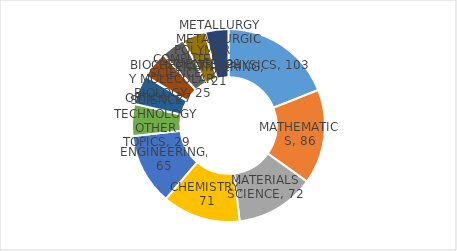
| Category | Series 0 |
|---|---|
| PHYSICS | 103 |
| MATHEMATICS | 86 |
| MATERIALS SCIENCE | 72 |
| CHEMISTRY | 71 |
| ENGINEERING | 65 |
| SCIENCE TECHNOLOGY OTHER TOPICS | 29 |
| OPTICS | 27 |
| BIOCHEMISTRY MOLECULAR BIOLOGY | 25 |
| COMPUTER SCIENCE | 22 |
| POLYMER SCIENCE | 21 |
| METALLURGY METALLURGICAL ENGINEERING | 21 |